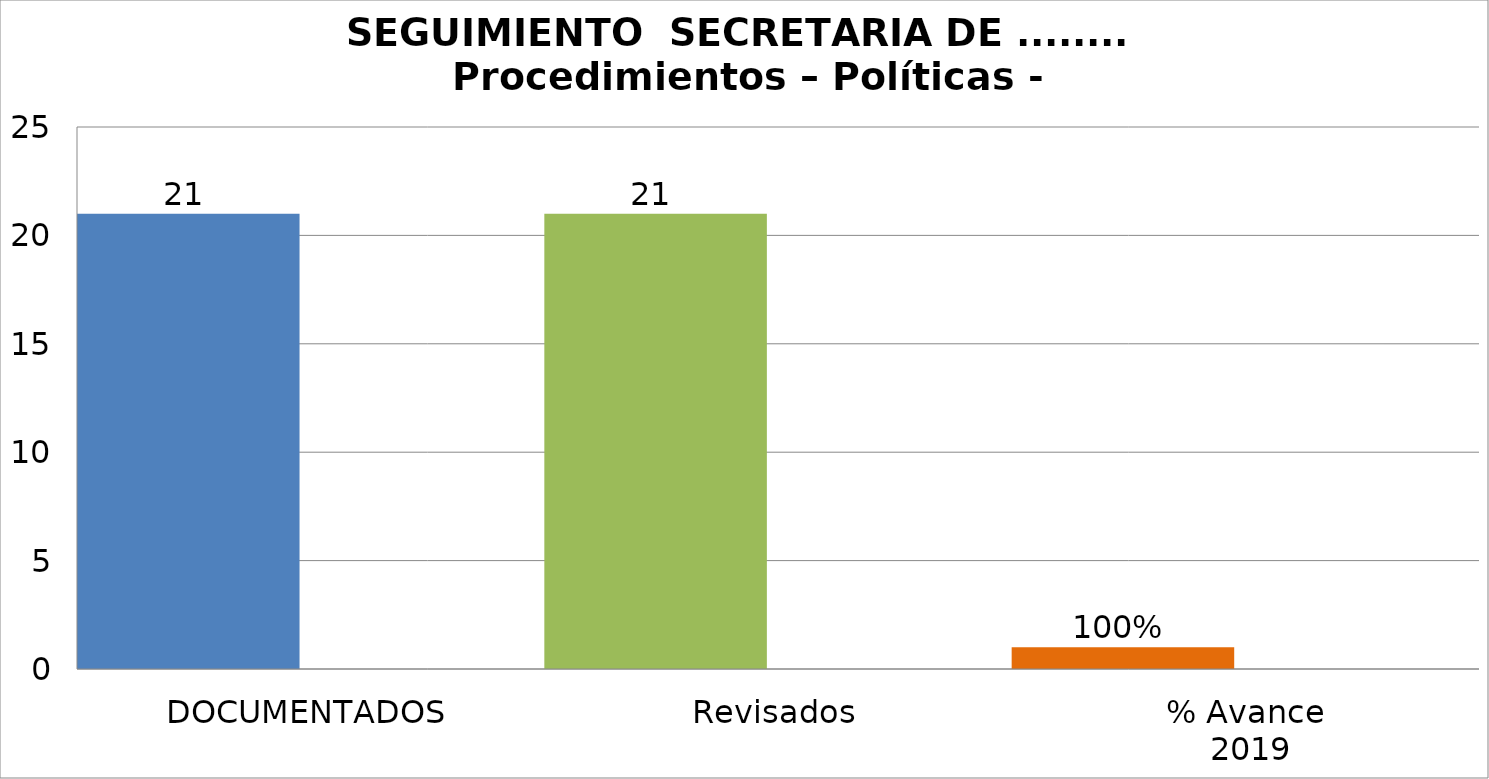
| Category | Series 0 | Series 1 | Series 4 |
|---|---|---|---|
| DOCUMENTADOS | 21 |  |  |
| Revisados | 21 |  |  |
| % Avance
 2019 | 1 |  |  |